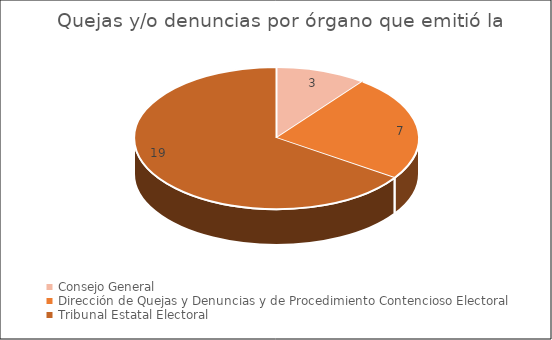
| Category | Quejas y/o denuncias por órgano que emitió la resolución |
|---|---|
| Consejo General | 3 |
| Dirección de Quejas y Denuncias y de Procedimiento Contencioso Electoral | 7 |
| Tribunal Estatal Electoral | 19 |